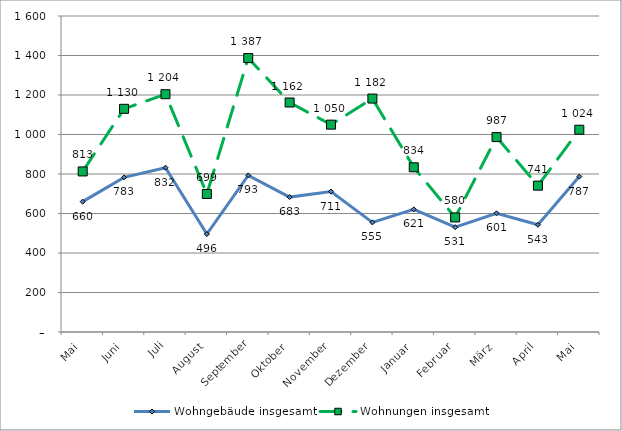
| Category | Wohngebäude insgesamt | Wohnungen insgesamt |
|---|---|---|
| Mai | 660 | 813 |
| Juni | 783 | 1130 |
| Juli | 832 | 1204 |
| August | 496 | 699 |
| September | 793 | 1387 |
| Oktober | 683 | 1162 |
| November | 711 | 1050 |
| Dezember | 555 | 1182 |
| Januar | 621 | 834 |
| Februar | 531 | 580 |
| März | 601 | 987 |
| April | 543 | 741 |
| Mai | 787 | 1024 |